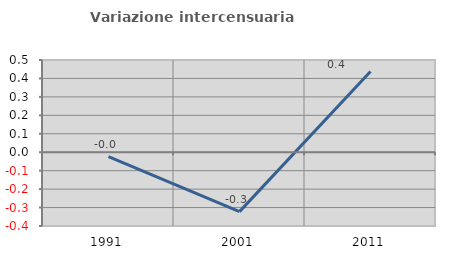
| Category | Variazione intercensuaria annua |
|---|---|
| 1991.0 | -0.024 |
| 2001.0 | -0.322 |
| 2011.0 | 0.437 |